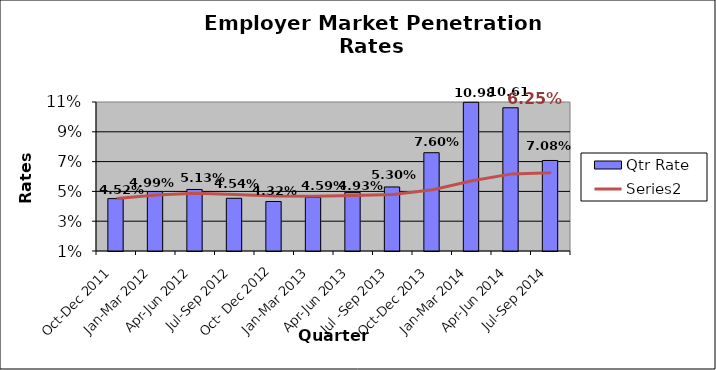
| Category | Qtr Rate |
|---|---|
| Oct-Dec 2011 | 0.045 |
| Jan-Mar 2012 | 0.05 |
| Apr-Jun 2012 | 0.051 |
| Jul-Sep 2012 | 0.045 |
| Oct- Dec 2012 | 0.043 |
| Jan-Mar 2013 | 0.046 |
| Apr-Jun 2013 | 0.049 |
| Jul -Sep 2013 | 0.053 |
| Oct-Dec 2013 | 0.076 |
| Jan-Mar 2014 | 0.11 |
| Apr-Jun 2014 | 0.106 |
| Jul-Sep 2014 | 0.071 |